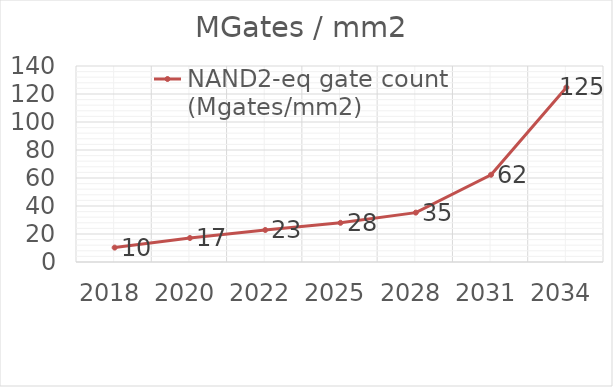
| Category | NAND2-eq gate count (Mgates/mm2) |
|---|---|
| 2018.0 | 10.288 |
| 2020.0 | 17.147 |
| 2022.0 | 22.862 |
| 2025.0 | 27.995 |
| 2028.0 | 35.273 |
| 2031.0 | 62.322 |
| 2034.0 | 124.644 |